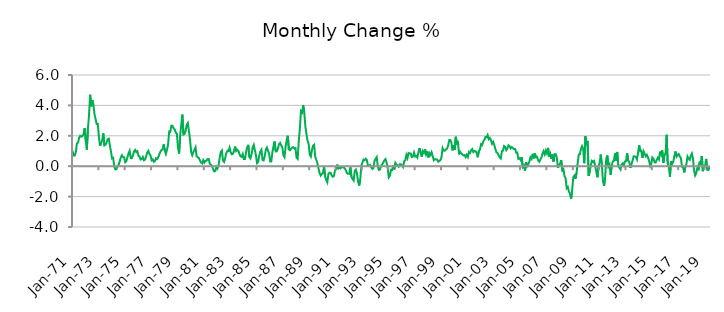
| Category | Series 0 |
|---|---|
| 1971-01-01 | 1.014 |
| 1971-02-01 | 0.711 |
| 1971-03-01 | 0.712 |
| 1971-04-01 | 0.919 |
| 1971-05-01 | 1.51 |
| 1971-06-01 | 1.551 |
| 1971-07-01 | 1.878 |
| 1971-08-01 | 2.005 |
| 1971-09-01 | 1.95 |
| 1971-10-01 | 1.987 |
| 1971-11-01 | 2.104 |
| 1971-12-01 | 2.509 |
| 1972-01-01 | 1.699 |
| 1972-02-01 | 1.094 |
| 1972-03-01 | 2.462 |
| 1972-04-01 | 3.36 |
| 1972-05-01 | 4.697 |
| 1972-06-01 | 3.937 |
| 1972-07-01 | 4.355 |
| 1972-08-01 | 4.026 |
| 1972-09-01 | 3.417 |
| 1972-10-01 | 3.088 |
| 1972-11-01 | 2.774 |
| 1972-12-01 | 2.784 |
| 1973-01-01 | 1.938 |
| 1973-02-01 | 1.343 |
| 1973-03-01 | 1.524 |
| 1973-04-01 | 1.712 |
| 1973-05-01 | 2.158 |
| 1973-06-01 | 1.373 |
| 1973-07-01 | 1.418 |
| 1973-08-01 | 1.551 |
| 1973-09-01 | 1.782 |
| 1973-10-01 | 1.816 |
| 1973-11-01 | 1.359 |
| 1973-12-01 | 0.961 |
| 1974-01-01 | 0.511 |
| 1974-02-01 | 0.548 |
| 1974-03-01 | -0.022 |
| 1974-04-01 | -0.216 |
| 1974-05-01 | -0.191 |
| 1974-06-01 | 0.007 |
| 1974-07-01 | 0.097 |
| 1974-08-01 | 0.326 |
| 1974-09-01 | 0.591 |
| 1974-10-01 | 0.722 |
| 1974-11-01 | 0.594 |
| 1974-12-01 | 0.583 |
| 1975-01-01 | 0.268 |
| 1975-02-01 | 0.337 |
| 1975-03-01 | 0.597 |
| 1975-04-01 | 0.845 |
| 1975-05-01 | 1.017 |
| 1975-06-01 | 0.539 |
| 1975-07-01 | 0.526 |
| 1975-08-01 | 0.722 |
| 1975-09-01 | 0.97 |
| 1975-10-01 | 1.067 |
| 1975-11-01 | 0.93 |
| 1975-12-01 | 0.985 |
| 1976-01-01 | 0.687 |
| 1976-02-01 | 0.643 |
| 1976-03-01 | 0.437 |
| 1976-04-01 | 0.463 |
| 1976-05-01 | 0.603 |
| 1976-06-01 | 0.392 |
| 1976-07-01 | 0.432 |
| 1976-08-01 | 0.636 |
| 1976-09-01 | 0.905 |
| 1976-10-01 | 1.011 |
| 1976-11-01 | 0.8 |
| 1976-12-01 | 0.709 |
| 1977-01-01 | 0.392 |
| 1977-02-01 | 0.448 |
| 1977-03-01 | 0.289 |
| 1977-04-01 | 0.338 |
| 1977-05-01 | 0.521 |
| 1977-06-01 | 0.47 |
| 1977-07-01 | 0.575 |
| 1977-08-01 | 0.784 |
| 1977-09-01 | 0.951 |
| 1977-10-01 | 1.061 |
| 1977-11-01 | 1.111 |
| 1977-12-01 | 1.434 |
| 1978-01-01 | 1.05 |
| 1978-02-01 | 0.811 |
| 1978-03-01 | 1.084 |
| 1978-04-01 | 1.443 |
| 1978-05-01 | 2.28 |
| 1978-06-01 | 2.255 |
| 1978-07-01 | 2.668 |
| 1978-08-01 | 2.665 |
| 1978-09-01 | 2.498 |
| 1978-10-01 | 2.424 |
| 1978-11-01 | 2.207 |
| 1978-12-01 | 2.133 |
| 1979-01-01 | 1.242 |
| 1979-02-01 | 0.823 |
| 1979-03-01 | 2.034 |
| 1979-04-01 | 2.732 |
| 1979-05-01 | 3.394 |
| 1979-06-01 | 2.083 |
| 1979-07-01 | 2.118 |
| 1979-08-01 | 2.335 |
| 1979-09-01 | 2.734 |
| 1979-10-01 | 2.841 |
| 1979-11-01 | 2.3 |
| 1979-12-01 | 1.747 |
| 1980-01-01 | 0.943 |
| 1980-02-01 | 0.726 |
| 1980-03-01 | 0.925 |
| 1980-04-01 | 1.073 |
| 1980-05-01 | 1.242 |
| 1980-06-01 | 0.656 |
| 1980-07-01 | 0.591 |
| 1980-08-01 | 0.543 |
| 1980-09-01 | 0.381 |
| 1980-10-01 | 0.243 |
| 1980-11-01 | 0.186 |
| 1980-12-01 | 0.395 |
| 1981-01-01 | 0.234 |
| 1981-02-01 | 0.354 |
| 1981-03-01 | 0.354 |
| 1981-04-01 | 0.474 |
| 1981-05-01 | 0.478 |
| 1981-06-01 | 0.161 |
| 1981-07-01 | 0.077 |
| 1981-08-01 | 0.019 |
| 1981-09-01 | -0.188 |
| 1981-10-01 | -0.344 |
| 1981-11-01 | -0.317 |
| 1981-12-01 | -0.035 |
| 1982-01-01 | -0.155 |
| 1982-02-01 | 0.068 |
| 1982-03-01 | 0.555 |
| 1982-04-01 | 0.929 |
| 1982-05-01 | 1.031 |
| 1982-06-01 | 0.372 |
| 1982-07-01 | 0.28 |
| 1982-08-01 | 0.532 |
| 1982-09-01 | 0.859 |
| 1982-10-01 | 1.012 |
| 1982-11-01 | 0.998 |
| 1982-12-01 | 1.225 |
| 1983-01-01 | 0.92 |
| 1983-02-01 | 0.783 |
| 1983-03-01 | 0.81 |
| 1983-04-01 | 0.995 |
| 1983-05-01 | 1.293 |
| 1983-06-01 | 1.001 |
| 1983-07-01 | 1.08 |
| 1983-08-01 | 1.015 |
| 1983-09-01 | 0.803 |
| 1983-10-01 | 0.652 |
| 1983-11-01 | 0.611 |
| 1983-12-01 | 0.798 |
| 1984-01-01 | 0.473 |
| 1984-02-01 | 0.478 |
| 1984-03-01 | 0.903 |
| 1984-04-01 | 1.241 |
| 1984-05-01 | 1.404 |
| 1984-06-01 | 0.614 |
| 1984-07-01 | 0.511 |
| 1984-08-01 | 0.774 |
| 1984-09-01 | 1.225 |
| 1984-10-01 | 1.401 |
| 1984-11-01 | 1.068 |
| 1984-12-01 | 0.734 |
| 1985-01-01 | 0.202 |
| 1985-02-01 | 0.279 |
| 1985-03-01 | 0.684 |
| 1985-04-01 | 0.954 |
| 1985-05-01 | 1.079 |
| 1985-06-01 | 0.413 |
| 1985-07-01 | 0.38 |
| 1985-08-01 | 0.656 |
| 1985-09-01 | 1.087 |
| 1985-10-01 | 1.228 |
| 1985-11-01 | 1.02 |
| 1985-12-01 | 0.807 |
| 1986-01-01 | 0.311 |
| 1986-02-01 | 0.317 |
| 1986-03-01 | 0.923 |
| 1986-04-01 | 1.322 |
| 1986-05-01 | 1.629 |
| 1986-06-01 | 0.97 |
| 1986-07-01 | 0.982 |
| 1986-08-01 | 1.161 |
| 1986-09-01 | 1.443 |
| 1986-10-01 | 1.536 |
| 1986-11-01 | 1.373 |
| 1986-12-01 | 1.263 |
| 1987-01-01 | 0.724 |
| 1987-02-01 | 0.595 |
| 1987-03-01 | 1.283 |
| 1987-04-01 | 1.705 |
| 1987-05-01 | 2.003 |
| 1987-06-01 | 1.108 |
| 1987-07-01 | 1.049 |
| 1987-08-01 | 1.142 |
| 1987-09-01 | 1.226 |
| 1987-10-01 | 1.253 |
| 1987-11-01 | 1.16 |
| 1987-12-01 | 1.188 |
| 1988-01-01 | 0.558 |
| 1988-02-01 | 0.478 |
| 1988-03-01 | 1.666 |
| 1988-04-01 | 2.466 |
| 1988-05-01 | 3.62 |
| 1988-06-01 | 3.526 |
| 1988-07-01 | 4.01 |
| 1988-08-01 | 3.546 |
| 1988-09-01 | 2.637 |
| 1988-10-01 | 2.133 |
| 1988-11-01 | 1.68 |
| 1988-12-01 | 1.467 |
| 1989-01-01 | 0.756 |
| 1989-02-01 | 0.634 |
| 1989-03-01 | 1.069 |
| 1989-04-01 | 1.347 |
| 1989-05-01 | 1.408 |
| 1989-06-01 | 0.607 |
| 1989-07-01 | 0.411 |
| 1989-08-01 | 0.192 |
| 1989-09-01 | -0.165 |
| 1989-10-01 | -0.462 |
| 1989-11-01 | -0.618 |
| 1989-12-01 | -0.507 |
| 1990-01-01 | -0.459 |
| 1990-02-01 | -0.019 |
| 1990-03-01 | -0.686 |
| 1990-04-01 | -0.897 |
| 1990-05-01 | -1.058 |
| 1990-06-01 | -0.51 |
| 1990-07-01 | -0.437 |
| 1990-08-01 | -0.428 |
| 1990-09-01 | -0.604 |
| 1990-10-01 | -0.695 |
| 1990-11-01 | -0.649 |
| 1990-12-01 | -0.278 |
| 1991-01-01 | -0.196 |
| 1991-02-01 | 0.105 |
| 1991-03-01 | -0.159 |
| 1991-04-01 | -0.105 |
| 1991-05-01 | -0.139 |
| 1991-06-01 | -0.062 |
| 1991-07-01 | -0.066 |
| 1991-08-01 | -0.093 |
| 1991-09-01 | -0.159 |
| 1991-10-01 | -0.285 |
| 1991-11-01 | -0.467 |
| 1991-12-01 | -0.497 |
| 1992-01-01 | -0.494 |
| 1992-02-01 | -0.076 |
| 1992-03-01 | -0.697 |
| 1992-04-01 | -0.848 |
| 1992-05-01 | -0.944 |
| 1992-06-01 | -0.312 |
| 1992-07-01 | -0.225 |
| 1992-08-01 | -0.473 |
| 1992-09-01 | -1.015 |
| 1992-10-01 | -1.272 |
| 1992-11-01 | -0.873 |
| 1992-12-01 | 0.026 |
| 1993-01-01 | 0.247 |
| 1993-02-01 | 0.437 |
| 1993-03-01 | 0.391 |
| 1993-04-01 | 0.487 |
| 1993-05-01 | 0.413 |
| 1993-06-01 | 0.047 |
| 1993-07-01 | 0.03 |
| 1993-08-01 | 0.082 |
| 1993-09-01 | -0.063 |
| 1993-10-01 | -0.18 |
| 1993-11-01 | -0.118 |
| 1993-12-01 | 0.35 |
| 1994-01-01 | 0.48 |
| 1994-02-01 | 0.595 |
| 1994-03-01 | -0.023 |
| 1994-04-01 | -0.241 |
| 1994-05-01 | -0.212 |
| 1994-06-01 | 0.019 |
| 1994-07-01 | 0.12 |
| 1994-08-01 | 0.247 |
| 1994-09-01 | 0.391 |
| 1994-10-01 | 0.472 |
| 1994-11-01 | 0.222 |
| 1994-12-01 | -0.131 |
| 1995-01-01 | -0.733 |
| 1995-02-01 | -0.635 |
| 1995-03-01 | -0.24 |
| 1995-04-01 | -0.251 |
| 1995-05-01 | 0.043 |
| 1995-06-01 | -0.212 |
| 1995-07-01 | 0.218 |
| 1995-08-01 | 0.097 |
| 1995-09-01 | 0.057 |
| 1995-10-01 | -0.036 |
| 1995-11-01 | 0.126 |
| 1995-12-01 | 0.123 |
| 1996-01-01 | 0.036 |
| 1996-02-01 | -0.061 |
| 1996-03-01 | 0.33 |
| 1996-04-01 | 0.389 |
| 1996-05-01 | 0.736 |
| 1996-06-01 | 0.535 |
| 1996-07-01 | 0.868 |
| 1996-08-01 | 0.833 |
| 1996-09-01 | 0.834 |
| 1996-10-01 | 0.603 |
| 1996-11-01 | 0.635 |
| 1996-12-01 | 0.892 |
| 1997-01-01 | 0.634 |
| 1997-02-01 | 0.672 |
| 1997-03-01 | 0.57 |
| 1997-04-01 | 0.919 |
| 1997-05-01 | 1.19 |
| 1997-06-01 | 0.893 |
| 1997-07-01 | 0.625 |
| 1997-08-01 | 0.99 |
| 1997-09-01 | 0.877 |
| 1997-10-01 | 1.126 |
| 1997-11-01 | 0.779 |
| 1997-12-01 | 0.981 |
| 1998-01-01 | 0.576 |
| 1998-02-01 | 0.861 |
| 1998-03-01 | 0.744 |
| 1998-04-01 | 0.917 |
| 1998-05-01 | 0.646 |
| 1998-06-01 | 0.394 |
| 1998-07-01 | 0.47 |
| 1998-08-01 | 0.438 |
| 1998-09-01 | 0.441 |
| 1998-10-01 | 0.291 |
| 1998-11-01 | 0.339 |
| 1998-12-01 | 0.406 |
| 1999-01-01 | 0.599 |
| 1999-02-01 | 1.189 |
| 1999-03-01 | 1.036 |
| 1999-04-01 | 1.017 |
| 1999-05-01 | 1.102 |
| 1999-06-01 | 1.154 |
| 1999-07-01 | 1.343 |
| 1999-08-01 | 1.715 |
| 1999-09-01 | 1.719 |
| 1999-10-01 | 1.552 |
| 1999-11-01 | 1.038 |
| 1999-12-01 | 1.38 |
| 2000-01-01 | 1.085 |
| 2000-02-01 | 1.936 |
| 2000-03-01 | 1.491 |
| 2000-04-01 | 1.566 |
| 2000-05-01 | 0.781 |
| 2000-06-01 | 0.949 |
| 2000-07-01 | 0.839 |
| 2000-08-01 | 0.775 |
| 2000-09-01 | 0.714 |
| 2000-10-01 | 0.729 |
| 2000-11-01 | 0.596 |
| 2000-12-01 | 0.754 |
| 2001-01-01 | 0.606 |
| 2001-02-01 | 0.935 |
| 2001-03-01 | 0.867 |
| 2001-04-01 | 1.055 |
| 2001-05-01 | 1.127 |
| 2001-06-01 | 0.924 |
| 2001-07-01 | 0.998 |
| 2001-08-01 | 0.985 |
| 2001-09-01 | 0.883 |
| 2001-10-01 | 0.588 |
| 2001-11-01 | 0.997 |
| 2001-12-01 | 1.094 |
| 2002-01-01 | 1.445 |
| 2002-02-01 | 1.384 |
| 2002-03-01 | 1.631 |
| 2002-04-01 | 1.728 |
| 2002-05-01 | 1.918 |
| 2002-06-01 | 1.906 |
| 2002-07-01 | 2.048 |
| 2002-08-01 | 1.783 |
| 2002-09-01 | 1.859 |
| 2002-10-01 | 1.71 |
| 2002-11-01 | 1.477 |
| 2002-12-01 | 1.602 |
| 2003-01-01 | 1.407 |
| 2003-02-01 | 1.139 |
| 2003-03-01 | 0.91 |
| 2003-04-01 | 0.863 |
| 2003-05-01 | 0.726 |
| 2003-06-01 | 0.579 |
| 2003-07-01 | 0.508 |
| 2003-08-01 | 0.993 |
| 2003-09-01 | 1.027 |
| 2003-10-01 | 1.329 |
| 2003-11-01 | 1.273 |
| 2003-12-01 | 1.053 |
| 2004-01-01 | 1.155 |
| 2004-02-01 | 1.378 |
| 2004-03-01 | 1.315 |
| 2004-04-01 | 1.176 |
| 2004-05-01 | 1.263 |
| 2004-06-01 | 1.184 |
| 2004-07-01 | 1.129 |
| 2004-08-01 | 1.135 |
| 2004-09-01 | 0.885 |
| 2004-10-01 | 0.896 |
| 2004-11-01 | 0.481 |
| 2004-12-01 | 0.525 |
| 2005-01-01 | 0.412 |
| 2005-02-01 | 0.601 |
| 2005-03-01 | -0.056 |
| 2005-04-01 | 0.041 |
| 2005-05-01 | -0.312 |
| 2005-06-01 | 0.273 |
| 2005-07-01 | 0.005 |
| 2005-08-01 | 0.13 |
| 2005-09-01 | 0.301 |
| 2005-10-01 | 0.587 |
| 2005-11-01 | 0.481 |
| 2005-12-01 | 0.815 |
| 2006-01-01 | 0.512 |
| 2006-02-01 | 0.839 |
| 2006-03-01 | 0.59 |
| 2006-04-01 | 0.61 |
| 2006-05-01 | 0.39 |
| 2006-06-01 | 0.294 |
| 2006-07-01 | 0.43 |
| 2006-08-01 | 0.57 |
| 2006-09-01 | 0.838 |
| 2006-10-01 | 0.993 |
| 2006-11-01 | 0.782 |
| 2006-12-01 | 1.025 |
| 2007-01-01 | 0.837 |
| 2007-02-01 | 1.203 |
| 2007-03-01 | 0.635 |
| 2007-04-01 | 0.824 |
| 2007-05-01 | 0.476 |
| 2007-06-01 | 0.769 |
| 2007-07-01 | 0.305 |
| 2007-08-01 | 0.796 |
| 2007-09-01 | 0.787 |
| 2007-10-01 | 0.58 |
| 2007-11-01 | -0.112 |
| 2007-12-01 | 0.065 |
| 2008-01-01 | 0.173 |
| 2008-02-01 | 0.401 |
| 2008-03-01 | -0.272 |
| 2008-04-01 | -0.195 |
| 2008-05-01 | -0.647 |
| 2008-06-01 | -0.781 |
| 2008-07-01 | -1.442 |
| 2008-08-01 | -1.364 |
| 2008-09-01 | -1.669 |
| 2008-10-01 | -1.821 |
| 2008-11-01 | -2.138 |
| 2008-12-01 | -1.553 |
| 2009-01-01 | -0.731 |
| 2009-02-01 | -0.621 |
| 2009-03-01 | -0.825 |
| 2009-04-01 | -0.427 |
| 2009-05-01 | 0.213 |
| 2009-06-01 | 0.764 |
| 2009-07-01 | 0.798 |
| 2009-08-01 | 1.133 |
| 2009-09-01 | 1.32 |
| 2009-10-01 | 1.163 |
| 2009-11-01 | 0.201 |
| 2009-12-01 | 1.966 |
| 2010-01-01 | 1.507 |
| 2010-02-01 | 1.665 |
| 2010-03-01 | -0.631 |
| 2010-04-01 | -0.333 |
| 2010-05-01 | 0.073 |
| 2010-06-01 | 0.35 |
| 2010-07-01 | 0.284 |
| 2010-08-01 | 0.345 |
| 2010-09-01 | -0.014 |
| 2010-10-01 | -0.392 |
| 2010-11-01 | -0.732 |
| 2010-12-01 | -0.005 |
| 2011-01-01 | 0.24 |
| 2011-02-01 | 0.761 |
| 2011-03-01 | 0.093 |
| 2011-04-01 | -0.951 |
| 2011-05-01 | -1.297 |
| 2011-06-01 | -0.711 |
| 2011-07-01 | 0.487 |
| 2011-08-01 | 0.71 |
| 2011-09-01 | -0.012 |
| 2011-10-01 | 0.126 |
| 2011-11-01 | -0.566 |
| 2011-12-01 | 0.032 |
| 2012-01-01 | 0.323 |
| 2012-02-01 | 0.352 |
| 2012-03-01 | 0.849 |
| 2012-04-01 | 0.375 |
| 2012-05-01 | 0.938 |
| 2012-06-01 | 0.004 |
| 2012-07-01 | -0.1 |
| 2012-08-01 | -0.217 |
| 2012-09-01 | 0.1 |
| 2012-10-01 | 0.185 |
| 2012-11-01 | 0.047 |
| 2012-12-01 | 0.311 |
| 2013-01-01 | 0.331 |
| 2013-02-01 | 0.856 |
| 2013-03-01 | 0.368 |
| 2013-04-01 | 0.266 |
| 2013-05-01 | -0.109 |
| 2013-06-01 | 0.137 |
| 2013-07-01 | 0.377 |
| 2013-08-01 | 0.653 |
| 2013-09-01 | 0.637 |
| 2013-10-01 | 0.618 |
| 2013-11-01 | 0.442 |
| 2013-12-01 | 0.903 |
| 2014-01-01 | 1.372 |
| 2014-02-01 | 0.988 |
| 2014-03-01 | 1.017 |
| 2014-04-01 | 0.553 |
| 2014-05-01 | 0.975 |
| 2014-06-01 | 0.817 |
| 2014-07-01 | 0.649 |
| 2014-08-01 | 0.748 |
| 2014-09-01 | 0.573 |
| 2014-10-01 | 0.364 |
| 2014-11-01 | 0.006 |
| 2014-12-01 | 0.136 |
| 2015-01-01 | 0.576 |
| 2015-02-01 | 0.494 |
| 2015-03-01 | 0.259 |
| 2015-04-01 | 0.24 |
| 2015-05-01 | 0.421 |
| 2015-06-01 | 0.552 |
| 2015-07-01 | 0.44 |
| 2015-08-01 | 0.958 |
| 2015-09-01 | 0.755 |
| 2015-10-01 | 1.043 |
| 2015-11-01 | 0.212 |
| 2015-12-01 | 0.764 |
| 2016-01-01 | 0.798 |
| 2016-02-01 | 2.067 |
| 2016-03-01 | 0.169 |
| 2016-04-01 | -0.006 |
| 2016-05-01 | -0.698 |
| 2016-06-01 | 0.334 |
| 2016-07-01 | 0.14 |
| 2016-08-01 | 0.289 |
| 2016-09-01 | 0.636 |
| 2016-10-01 | 0.968 |
| 2016-11-01 | 0.632 |
| 2016-12-01 | 0.743 |
| 2017-01-01 | 0.799 |
| 2017-02-01 | 0.633 |
| 2017-03-01 | 0.532 |
| 2017-04-01 | -0.041 |
| 2017-05-01 | -0.065 |
| 2017-06-01 | -0.409 |
| 2017-07-01 | -0.073 |
| 2017-08-01 | 0.136 |
| 2017-09-01 | 0.638 |
| 2017-10-01 | 0.488 |
| 2017-11-01 | 0.417 |
| 2017-12-01 | 0.676 |
| 2018-01-01 | 0.828 |
| 2018-02-01 | 0.504 |
| 2018-03-01 | -0.282 |
| 2018-04-01 | -0.612 |
| 2018-05-01 | -0.47 |
| 2018-06-01 | -0.086 |
| 2018-07-01 | -0.27 |
| 2018-08-01 | 0.24 |
| 2018-09-01 | 0.169 |
| 2018-10-01 | 0.666 |
| 2018-11-01 | -0.326 |
| 2018-12-01 | 0.021 |
| 2019-01-01 | -0.003 |
| 2019-02-01 | 0.479 |
| 2019-03-01 | -0.236 |
| 2019-04-01 | -0.253 |
| 2019-05-01 | -0.066 |